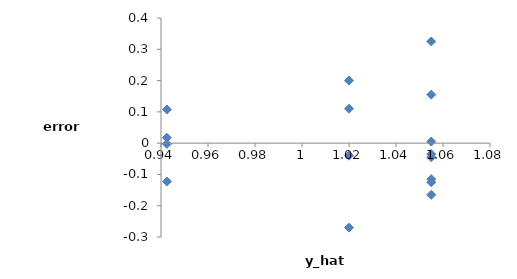
| Category | e |
|---|---|
| 0.9424999999999999 | 0.018 |
| 0.9424999999999999 | 0.108 |
| 0.9424999999999999 | -0.122 |
| 0.9424999999999999 | -0.002 |
| 1.02 | -0.27 |
| 1.02 | 0.2 |
| 1.02 | 0.11 |
| 1.02 | -0.04 |
| 1.055 | -0.045 |
| 1.055 | -0.165 |
| 1.055 | -0.115 |
| 1.055 | 0.325 |
| 1.0550000000000002 | -0.125 |
| 1.0550000000000002 | -0.035 |
| 1.0550000000000002 | 0.005 |
| 1.0550000000000002 | 0.155 |